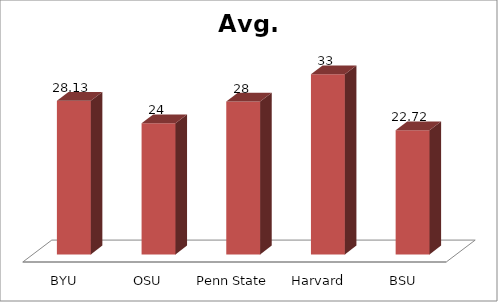
| Category | Avg. ACT |
|---|---|
| BYU | 28.13 |
| OSU | 24 |
| Penn State | 28 |
| Harvard | 33 |
| BSU | 22.72 |